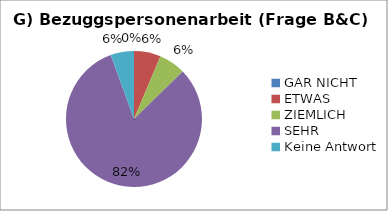
| Category | Series 0 |
|---|---|
| GAR NICHT | 0 |
| ETWAS | 8 |
| ZIEMLICH | 8 |
| SEHR | 103 |
| Keine Antwort | 7 |